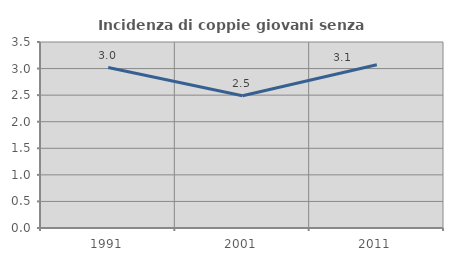
| Category | Incidenza di coppie giovani senza figli |
|---|---|
| 1991.0 | 3.02 |
| 2001.0 | 2.488 |
| 2011.0 | 3.073 |